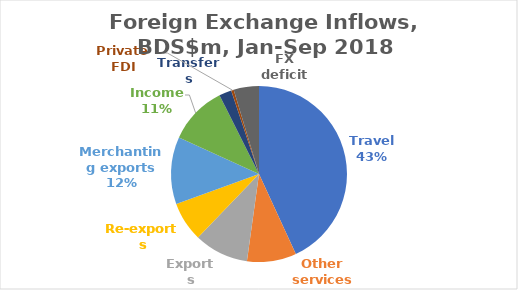
| Category | Series 0 |
|---|---|
| Travel | 1660 |
| Other services | 349 |
| Exports | 385 |
| Re-exports | 280 |
| Merchanting exports | 475 |
| Income | 415 |
| Transfers | 88 |
| Private FDI | 18 |
| FX deficit | 179 |